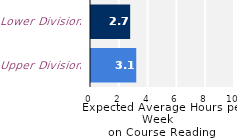
| Category | Series 0 |
|---|---|
| Upper Division | 3.143 |
| Lower Division | 2.72 |